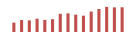
| Category | Importações (2) |
|---|---|
| 0 | 62681.056 |
| 1 | 79621.593 |
| 2 | 77709.867 |
| 3 | 88593.929 |
| 4 | 80744.22 |
| 5 | 85348.563 |
| 6 | 121368.935 |
| 7 | 124143.971 |
| 8 | 115571.707 |
| 9 | 109068.986 |
| 10 | 136178.726 |
| 11 | 153404.387 |
| 12 | 167744.463 |
| 13 | 164346.623 |
| 14 | 164863.396 |